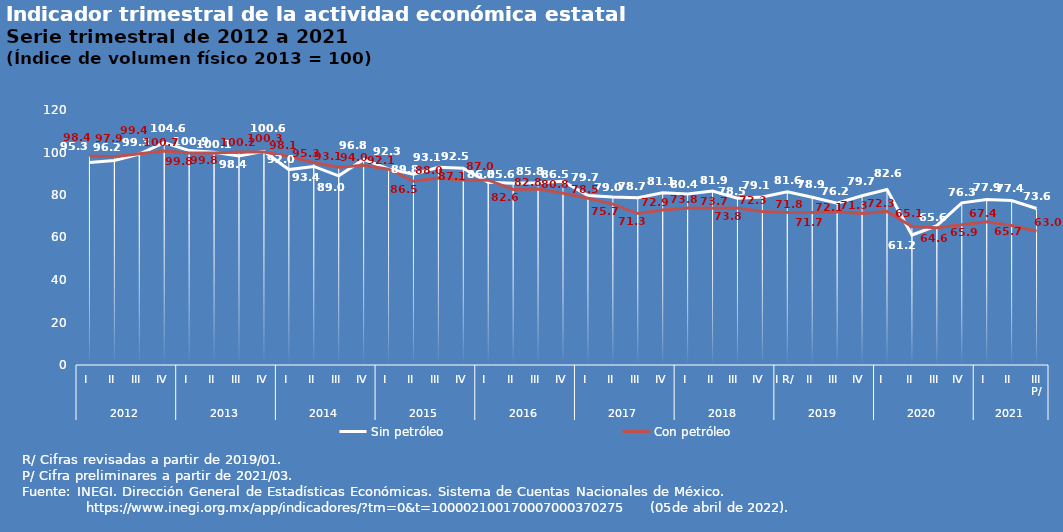
| Category | Sin petróleo | Con petróleo |
|---|---|---|
| 0 | 95.326 | 98.379 |
| 1 | 96.24 | 97.947 |
| 2 | 99.258 | 99.439 |
| 3 | 104.634 | 100.742 |
| 4 | 100.901 | 99.788 |
| 5 | 100.125 | 99.769 |
| 6 | 98.409 | 100.191 |
| 7 | 100.564 | 100.252 |
| 8 | 91.961 | 98.146 |
| 9 | 93.443 | 95.327 |
| 10 | 89.033 | 93.08 |
| 11 | 96.76 | 93.975 |
| 12 | 92.277 | 92.119 |
| 13 | 89.803 | 86.463 |
| 14 | 93.085 | 88.03 |
| 15 | 92.539 | 87.079 |
| 16 | 85.971 | 86.975 |
| 17 | 85.585 | 82.593 |
| 18 | 85.821 | 82.784 |
| 19 | 86.509 | 80.819 |
| 20 | 79.71 | 78.477 |
| 21 | 79.018 | 75.721 |
| 22 | 78.722 | 71.266 |
| 23 | 81.088 | 72.91 |
| 24 | 80.442 | 73.835 |
| 25 | 81.882 | 73.735 |
| 26 | 78.519 | 73.844 |
| 27 | 79.105 | 72.29 |
| 28 | 81.553 | 71.76 |
| 29 | 78.937 | 71.747 |
| 30 | 76.192 | 72.108 |
| 31 | 79.674 | 71.347 |
| 32 | 82.624 | 72.29 |
| 33 | 61.165 | 65.127 |
| 34 | 65.58 | 64.552 |
| 35 | 76.307 | 65.946 |
| 36 | 77.86 | 67.362 |
| 37 | 77.381 | 65.653 |
| 38 | 73.644 | 62.962 |